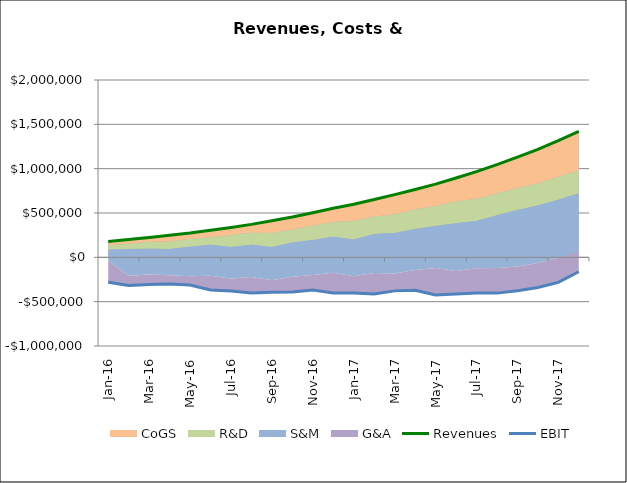
| Category | Revenues | EBIT |
|---|---|---|
| 0 | 178550 | -280169.25 |
| 1900-01-01 | 200667.75 | -318397.396 |
| 1900-01-02 | 223654.259 | -306224.066 |
| 1900-01-03 | 247826.624 | -301524.971 |
| 1900-01-04 | 273202.111 | -311935.174 |
| 1900-01-05 | 304849.422 | -369145.25 |
| 1900-01-06 | 337323.265 | -378440.376 |
| 1900-01-07 | 371722.552 | -402069.993 |
| 1900-01-08 | 412659.028 | -394119.941 |
| 1900-01-09 | 455207.05 | -390925.901 |
| 1900-01-10 | 503494.797 | -367477.001 |
| 1900-01-11 | 554339.431 | -401946.392 |
| 1900-01-12 | 599459.446 | -403547.579 |
| 1900-01-13 | 652440.775 | -414596.229 |
| 1900-01-14 | 707656.275 | -378272.322 |
| 1900-01-15 | 765460.875 | -370558.843 |
| 1900-01-16 | 825728.896 | -425114.505 |
| 1900-01-17 | 894593.714 | -414341.437 |
| 1900-01-18 | 966271.178 | -400995.431 |
| 1900-01-19 | 1046405.492 | -403609.25 |
| 1900-01-20 | 1130377.118 | -375703.793 |
| 1900-01-21 | 1218407.066 | -340437.888 |
| 1900-01-22 | 1315052.814 | -283061.816 |
| 1900-01-23 | 1421769.644 | -162739.258 |